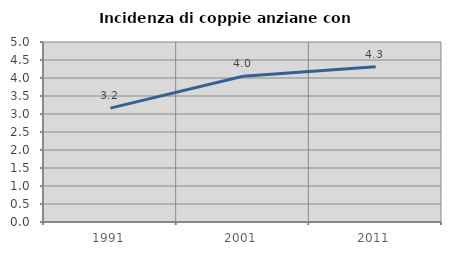
| Category | Incidenza di coppie anziane con figli |
|---|---|
| 1991.0 | 3.162 |
| 2001.0 | 4.047 |
| 2011.0 | 4.314 |